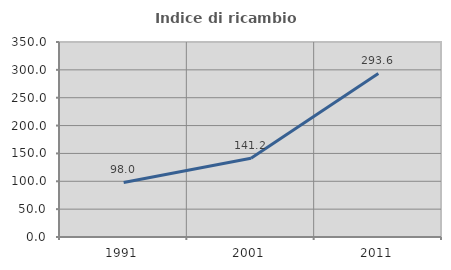
| Category | Indice di ricambio occupazionale  |
|---|---|
| 1991.0 | 97.987 |
| 2001.0 | 141.176 |
| 2011.0 | 293.59 |